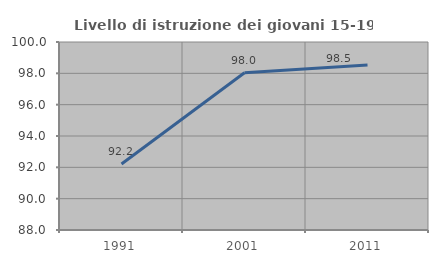
| Category | Livello di istruzione dei giovani 15-19 anni |
|---|---|
| 1991.0 | 92.208 |
| 2001.0 | 98.039 |
| 2011.0 | 98.529 |